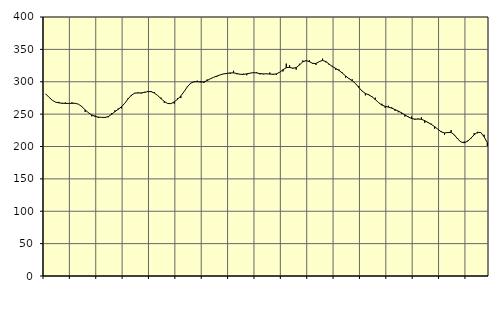
| Category | Piggar | Series 1 |
|---|---|---|
| nan | 281 | 281.24 |
| 87.0 | 276.2 | 276.09 |
| 87.0 | 271.5 | 271.44 |
| 87.0 | 268.3 | 268.53 |
| nan | 268.9 | 267.4 |
| 88.0 | 266.1 | 266.85 |
| 88.0 | 268 | 266.55 |
| 88.0 | 266.9 | 266.56 |
| nan | 268.2 | 266.75 |
| 89.0 | 267 | 266.68 |
| 89.0 | 265.2 | 265.19 |
| 89.0 | 261.7 | 261.53 |
| nan | 253.4 | 256.52 |
| 90.0 | 252.4 | 252.01 |
| 90.0 | 246.6 | 248.76 |
| 90.0 | 247.8 | 246.52 |
| nan | 244 | 245.4 |
| 91.0 | 245 | 244.96 |
| 91.0 | 245.4 | 244.95 |
| 91.0 | 245.2 | 246.22 |
| nan | 251.3 | 249.6 |
| 92.0 | 255.8 | 253.83 |
| 92.0 | 258.6 | 257.41 |
| 92.0 | 259 | 261.33 |
| nan | 266.8 | 266.8 |
| 93.0 | 274.4 | 273.44 |
| 93.0 | 277.9 | 279.18 |
| 93.0 | 282.8 | 282.31 |
| nan | 282.2 | 282.87 |
| 94.0 | 281.8 | 282.74 |
| 94.0 | 284.4 | 283.55 |
| 94.0 | 285.7 | 284.8 |
| nan | 285.6 | 284.74 |
| 95.0 | 284 | 282.5 |
| 95.0 | 278.6 | 278.71 |
| 95.0 | 275.4 | 273.93 |
| nan | 267.4 | 269.5 |
| 96.0 | 266.2 | 266.45 |
| 96.0 | 266.1 | 266.17 |
| 96.0 | 266.3 | 268.9 |
| nan | 274.6 | 272.88 |
| 97.0 | 274.8 | 278.07 |
| 97.0 | 285.1 | 284.81 |
| 97.0 | 293.1 | 292.22 |
| nan | 298.1 | 297.74 |
| 98.0 | 299.6 | 299.95 |
| 98.0 | 301.6 | 300.14 |
| 98.0 | 301.1 | 299.56 |
| nan | 298.2 | 299.75 |
| 99.0 | 303.5 | 301.79 |
| 99.0 | 305 | 304.64 |
| 99.0 | 306.9 | 306.92 |
| nan | 307.9 | 308.84 |
| 0.0 | 310.9 | 310.81 |
| 0.0 | 311.9 | 312.1 |
| 0.0 | 312.2 | 312.91 |
| nan | 312.2 | 313.65 |
| 1.0 | 316.9 | 313.73 |
| 1.0 | 311.6 | 312.74 |
| 1.0 | 311.3 | 311.52 |
| nan | 312.4 | 311.38 |
| 2.0 | 310.1 | 312.19 |
| 2.0 | 313.2 | 313.27 |
| 2.0 | 313.7 | 314.04 |
| nan | 314.6 | 313.65 |
| 3.0 | 311.3 | 312.55 |
| 3.0 | 311.5 | 312.12 |
| 3.0 | 312.5 | 312.21 |
| nan | 314.2 | 311.89 |
| 4.0 | 310.8 | 311.54 |
| 4.0 | 310.7 | 312.17 |
| 4.0 | 315.1 | 314.67 |
| nan | 315.9 | 318.57 |
| 5.0 | 328 | 321.79 |
| 5.0 | 325.4 | 322.26 |
| 5.0 | 320.3 | 320.95 |
| nan | 318.7 | 321.81 |
| 6.0 | 327.7 | 325.91 |
| 6.0 | 332.8 | 330.68 |
| 6.0 | 333.5 | 332.58 |
| nan | 333.2 | 331.03 |
| 7.0 | 327.6 | 328.45 |
| 7.0 | 326 | 328.25 |
| 7.0 | 330.8 | 331.04 |
| nan | 335.7 | 332.96 |
| 8.0 | 329.9 | 331.24 |
| 8.0 | 326.1 | 327.22 |
| 8.0 | 324.5 | 323.4 |
| nan | 318.5 | 320.57 |
| 9.0 | 318.9 | 317.49 |
| 9.0 | 314.2 | 313.43 |
| 9.0 | 306.4 | 308.9 |
| nan | 304.3 | 304.91 |
| 10.0 | 303.7 | 301.57 |
| 10.0 | 297.1 | 297.27 |
| 10.0 | 293.5 | 291.22 |
| nan | 285.9 | 285.56 |
| 11.0 | 279 | 282 |
| 11.0 | 280.6 | 279.8 |
| 11.0 | 277.5 | 276.9 |
| nan | 275.4 | 272.55 |
| 12.0 | 267.6 | 267.76 |
| 12.0 | 266 | 263.97 |
| 12.0 | 259.8 | 261.96 |
| nan | 262.9 | 260.85 |
| 13.0 | 260.4 | 259.22 |
| 13.0 | 255.1 | 256.99 |
| 13.0 | 252.9 | 254.63 |
| nan | 250.5 | 251.95 |
| 14.0 | 246.2 | 248.83 |
| 14.0 | 246.1 | 245.73 |
| 14.0 | 246.2 | 243.24 |
| nan | 241.4 | 242.24 |
| 15.0 | 243 | 242.39 |
| 15.0 | 245 | 241.98 |
| 15.0 | 236.6 | 239.94 |
| nan | 236.3 | 237.04 |
| 16.0 | 235.2 | 234.1 |
| 16.0 | 227.5 | 230.79 |
| 16.0 | 226.5 | 226.57 |
| nan | 223.7 | 222.59 |
| 17.0 | 218 | 220.95 |
| 17.0 | 222.4 | 221.59 |
| 17.0 | 225.2 | 221.79 |
| nan | 217.3 | 217.92 |
| 18.0 | 212.6 | 211.6 |
| 18.0 | 207 | 206.98 |
| 18.0 | 207.7 | 205.79 |
| nan | 208.9 | 208.1 |
| 19.0 | 212 | 212.82 |
| 19.0 | 220.6 | 218.09 |
| 19.0 | 220.4 | 221.96 |
| nan | 221.8 | 221.53 |
| 20.0 | 218.2 | 215.16 |
| 20.0 | 200.5 | 205.81 |